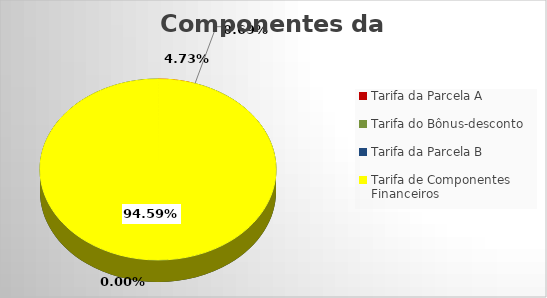
| Category | Series 0 |
|---|---|
| Tarifa da Parcela A                                          | 0.265 |
| Tarifa do Bônus-desconto | 0.038 |
| Tarifa da Parcela B | 5.298 |
| Tarifa de Componentes Financeiros    | 0 |